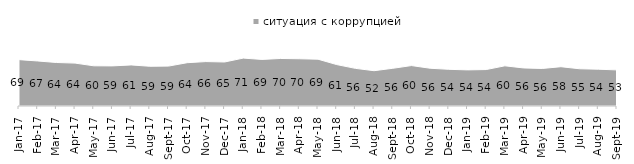
| Category | ситуация с коррупцией |
|---|---|
| 2017-01-01 | 68.7 |
| 2017-02-01 | 66.7 |
| 2017-03-01 | 64.45 |
| 2017-04-01 | 63.55 |
| 2017-05-01 | 59.55 |
| 2017-06-01 | 59.4 |
| 2017-07-01 | 60.85 |
| 2017-08-01 | 58.85 |
| 2017-09-01 | 59.1 |
| 2017-10-01 | 64.15 |
| 2017-11-01 | 65.8 |
| 2017-12-01 | 65.2 |
| 2018-01-01 | 70.95 |
| 2018-02-01 | 69 |
| 2018-03-01 | 70.4 |
| 2018-04-01 | 70 |
| 2018-05-01 | 69.35 |
| 2018-06-01 | 61.35 |
| 2018-07-01 | 55.75 |
| 2018-08-01 | 52.3 |
| 2018-09-01 | 55.85 |
| 2018-10-01 | 59.9 |
| 2018-11-01 | 55.938 |
| 2018-12-01 | 54.35 |
| 2019-01-01 | 53.5 |
| 2019-02-01 | 54 |
| 2019-03-01 | 59.523 |
| 2019-04-01 | 56.386 |
| 2019-05-01 | 55.622 |
| 2019-06-01 | 58.204 |
| 2019-07-01 | 55.149 |
| 2019-08-01 | 54.496 |
| 2019-09-01 | 53.465 |